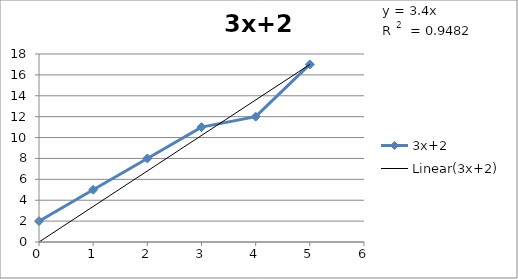
| Category | 3x+2 |
|---|---|
| 0.0 | 2 |
| 1.0 | 5 |
| 2.0 | 8 |
| 3.0 | 11 |
| 4.0 | 12 |
| 5.0 | 17 |